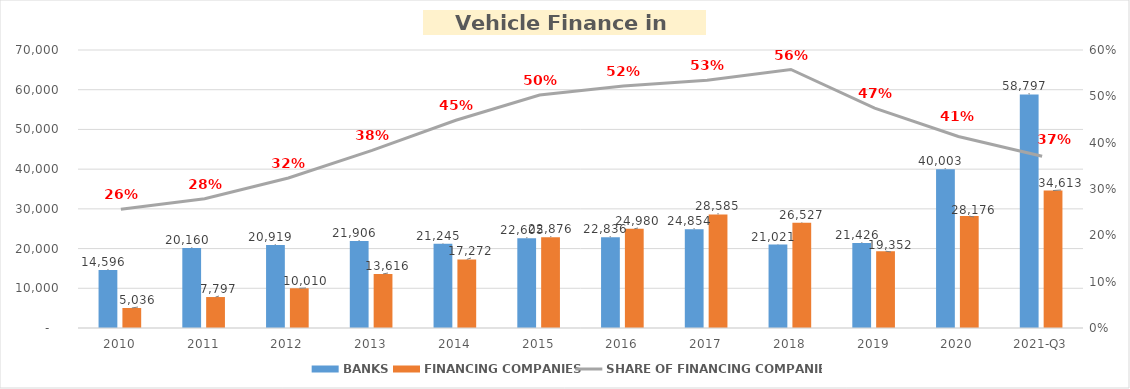
| Category | BANKS | FINANCING COMPANIES |
|---|---|---|
| 2010 | 14595.746 | 5035.89 |
| 2011 | 20160.143 | 7796.854 |
| 2012 | 20919.143 | 10009.755 |
| 2013 | 21905.99 | 13616.036 |
| 2014 | 21244.953 | 17271.844 |
| 2015 | 22605.033 | 22875.563 |
| 2016 | 22835.961 | 24980.231 |
| 2017 | 24853.571 | 28584.938 |
| 2018 | 21021.01 | 26527.133 |
| 2019 | 21426.278 | 19352.327 |
| 2020 | 40002.964 | 28176.3 |
| 2021-Q3 | 58797.203 | 34612.917 |